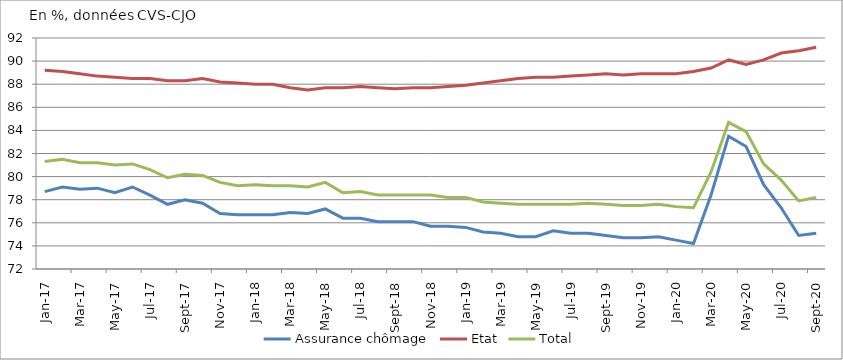
| Category | Assurance chômage | Etat | Total |
|---|---|---|---|
| 2017-01-01 | 78.7 | 89.2 | 81.3 |
| 2017-02-01 | 79.1 | 89.1 | 81.5 |
| 2017-03-01 | 78.9 | 88.9 | 81.2 |
| 2017-04-01 | 79 | 88.7 | 81.2 |
| 2017-05-01 | 78.6 | 88.6 | 81 |
| 2017-06-01 | 79.1 | 88.5 | 81.1 |
| 2017-07-01 | 78.4 | 88.5 | 80.6 |
| 2017-08-01 | 77.6 | 88.3 | 79.9 |
| 2017-09-01 | 78 | 88.3 | 80.2 |
| 2017-10-01 | 77.7 | 88.5 | 80.1 |
| 2017-11-01 | 76.8 | 88.2 | 79.5 |
| 2017-12-01 | 76.7 | 88.1 | 79.2 |
| 2018-01-01 | 76.7 | 88 | 79.3 |
| 2018-02-01 | 76.7 | 88 | 79.2 |
| 2018-03-01 | 76.9 | 87.7 | 79.2 |
| 2018-04-01 | 76.8 | 87.5 | 79.1 |
| 2018-05-01 | 77.2 | 87.7 | 79.5 |
| 2018-06-01 | 76.4 | 87.7 | 78.6 |
| 2018-07-01 | 76.4 | 87.8 | 78.7 |
| 2018-08-01 | 76.1 | 87.7 | 78.4 |
| 2018-09-01 | 76.1 | 87.6 | 78.4 |
| 2018-10-01 | 76.1 | 87.7 | 78.4 |
| 2018-11-01 | 75.7 | 87.7 | 78.4 |
| 2018-12-01 | 75.7 | 87.8 | 78.2 |
| 2019-01-01 | 75.6 | 87.9 | 78.2 |
| 2019-02-01 | 75.2 | 88.1 | 77.8 |
| 2019-03-01 | 75.1 | 88.3 | 77.7 |
| 2019-04-01 | 74.8 | 88.5 | 77.6 |
| 2019-05-01 | 74.8 | 88.6 | 77.6 |
| 2019-06-01 | 75.3 | 88.6 | 77.6 |
| 2019-07-01 | 75.1 | 88.7 | 77.6 |
| 2019-08-01 | 75.1 | 88.8 | 77.7 |
| 2019-09-01 | 74.9 | 88.9 | 77.6 |
| 2019-10-01 | 74.7 | 88.8 | 77.5 |
| 2019-11-01 | 74.7 | 88.9 | 77.5 |
| 2019-12-01 | 74.8 | 88.9 | 77.6 |
| 2020-01-01 | 74.5 | 88.9 | 77.4 |
| 2020-02-01 | 74.2 | 89.1 | 77.3 |
| 2020-03-01 | 78.4 | 89.4 | 80.4 |
| 2020-04-01 | 83.5 | 90.1 | 84.7 |
| 2020-05-01 | 82.6 | 89.7 | 83.9 |
| 2020-06-01 | 79.3 | 90.1 | 81.1 |
| 2020-07-01 | 77.3 | 90.7 | 79.7 |
| 2020-08-01 | 74.9 | 90.9 | 77.9 |
| 2020-09-01 | 75.1 | 91.2 | 78.2 |